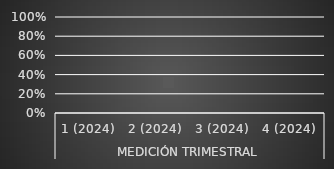
| Category | Series 1 | Series 0 |
|---|---|---|
| 0 | 0 | 0 |
| 1 | 0 | 0 |
| 2 | 0 | 0 |
| 3 | 0 | 0 |